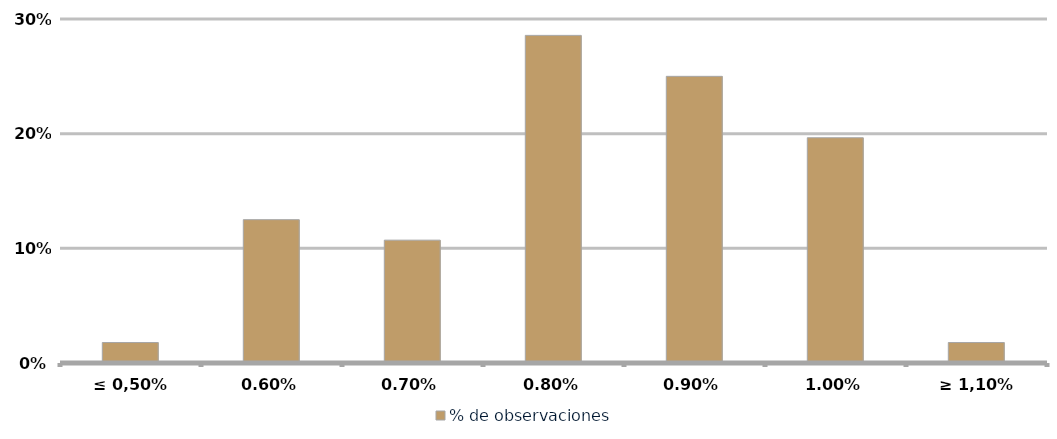
| Category | % de observaciones  |
|---|---|
| ≤ 0,50% | 0.018 |
| 0,60% | 0.125 |
| 0,70% | 0.107 |
| 0,80% | 0.286 |
| 0,90% | 0.25 |
| 1,00% | 0.196 |
| ≥ 1,10% | 0.018 |